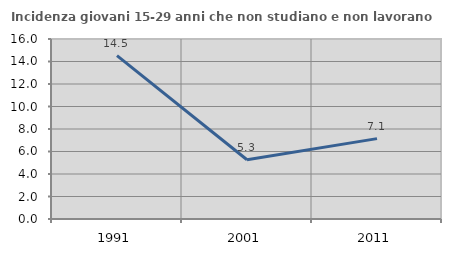
| Category | Incidenza giovani 15-29 anni che non studiano e non lavorano  |
|---|---|
| 1991.0 | 14.526 |
| 2001.0 | 5.263 |
| 2011.0 | 7.143 |